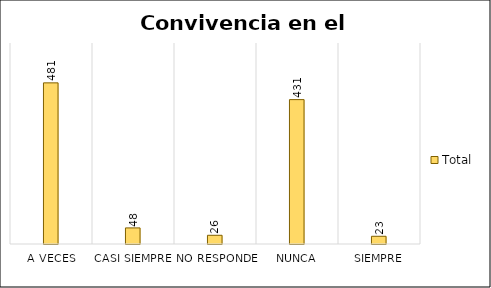
| Category | Total |
|---|---|
| A veces | 481 |
| Casi siempre | 48 |
| No responde | 26 |
| Nunca | 431 |
| Siempre | 23 |